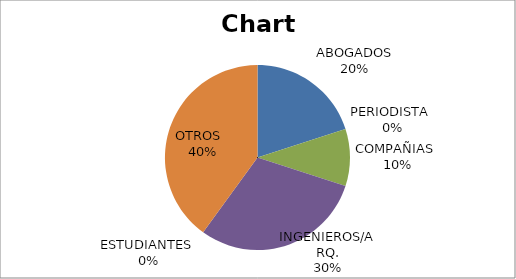
| Category | Series 0 |
|---|---|
| ABOGADOS | 2 |
| PERIODISTA  | 0 |
| COMPAÑIAS  | 1 |
| INGENIEROS/ARQ. | 3 |
| ESTUDIANTES  | 0 |
| OTROS   | 4 |